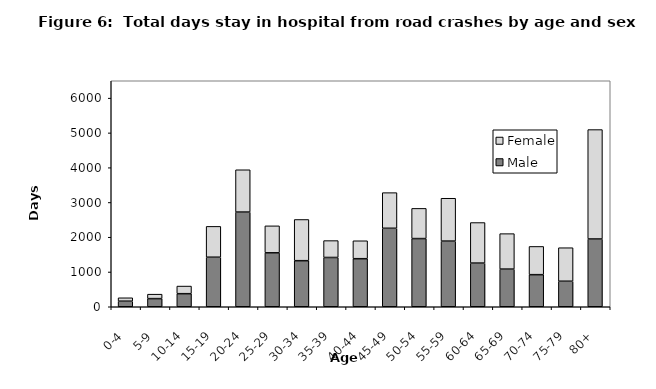
| Category | Male | Female |
|---|---|---|
| 0-4 | 160 | 98 |
| 5-9 | 234 | 128 |
| 10-14 | 376 | 219 |
| 15-19 | 1425 | 887 |
| 20-24 | 2723 | 1217 |
| 25-29 | 1551 | 776 |
| 30-34 | 1325 | 1185 |
| 35-39 | 1417 | 486 |
| 40-44 | 1382 | 516 |
| 45-49 | 2257 | 1025 |
| 50-54 | 1961 | 868 |
| 55-59 | 1888 | 1233 |
| 60-64 | 1256 | 1166 |
| 65-69 | 1083 | 1020 |
| 70-74 | 923 | 812 |
| 75-79 | 734 | 964 |
| 80+ | 1949 | 3147 |